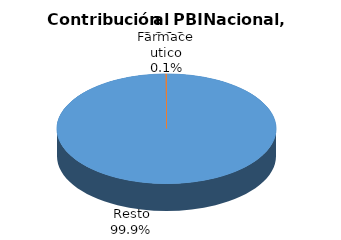
| Category | Series 0 |
|---|---|
| Resto | 545596 |
| Farmaceutico | 812 |